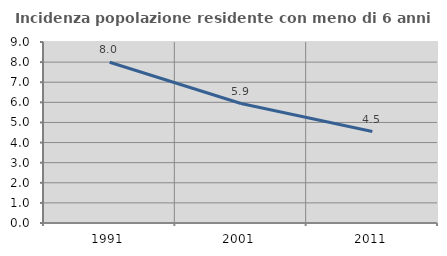
| Category | Incidenza popolazione residente con meno di 6 anni |
|---|---|
| 1991.0 | 7.993 |
| 2001.0 | 5.942 |
| 2011.0 | 4.548 |